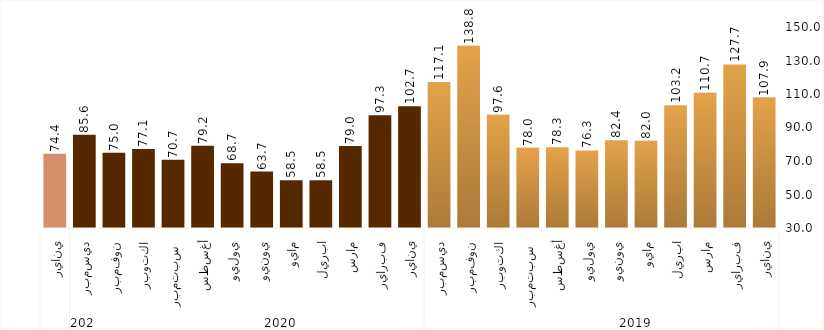
| Category | Series 0 |
|---|---|
| 0 | 107.861 |
| 1 | 127.674 |
| 2 | 110.742 |
| 3 | 103.239 |
| 4 | 82.016 |
| 5 | 82.421 |
| 6 | 76.314 |
| 7 | 78.265 |
| 8 | 77.961 |
| 9 | 97.566 |
| 10 | 138.85 |
| 11 | 117.091 |
| 12 | 102.678 |
| 13 | 97.332 |
| 14 | 78.955 |
| 15 | 58.549 |
| 16 | 58.455 |
| 17 | 63.691 |
| 18 | 68.721 |
| 19 | 79.161 |
| 20 | 70.692 |
| 21 | 77.111 |
| 22 | 74.955 |
| 23 | 85.627 |
| 24 | 74.378 |